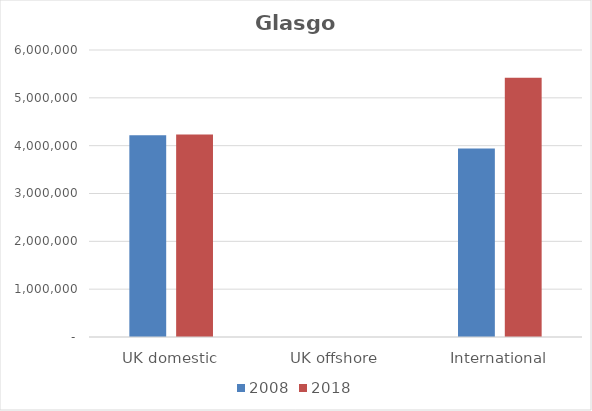
| Category | 2008 | 2018 |
|---|---|---|
| UK domestic | 4216257 | 4232830 |
| UK offshore | 0 | 0 |
| International | 3940642 | 5418127 |